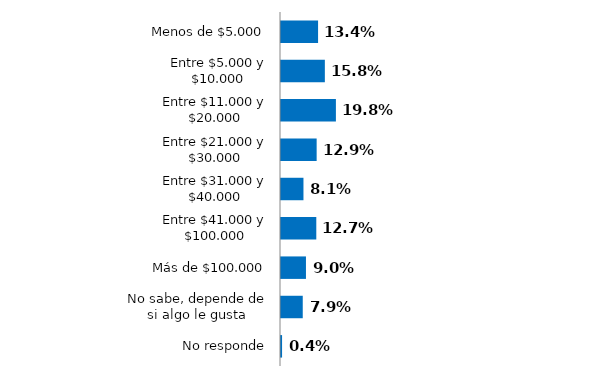
| Category | Series 0 |
|---|---|
| Menos de $5.000 | 0.134 |
| Entre $5.000 y $10.000 | 0.158 |
| Entre $11.000 y $20.000 | 0.198 |
| Entre $21.000 y $30.000 | 0.129 |
| Entre $31.000 y $40.000 | 0.081 |
| Entre $41.000 y $100.000 | 0.127 |
| Más de $100.000 | 0.09 |
| No sabe, depende de si algo le gusta | 0.079 |
| No responde | 0.004 |